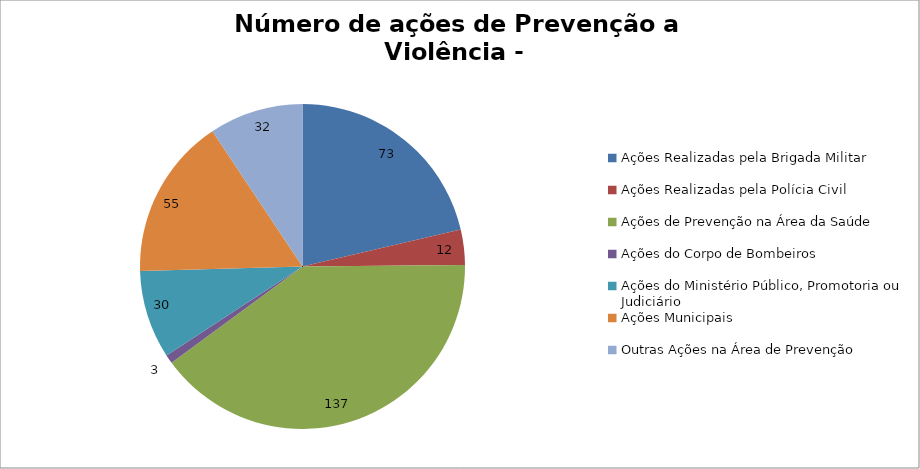
| Category | Número de Ações |
|---|---|
| Ações Realizadas pela Brigada Militar | 73 |
| Ações Realizadas pela Polícia Civil | 12 |
| Ações de Prevenção na Área da Saúde | 137 |
| Ações do Corpo de Bombeiros | 3 |
| Ações do Ministério Público, Promotoria ou Judiciário | 30 |
| Ações Municipais | 55 |
| Outras Ações na Área de Prevenção | 32 |